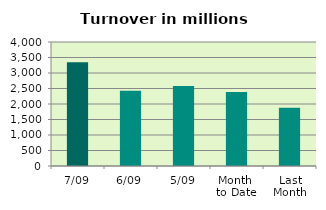
| Category | Series 0 |
|---|---|
| 7/09 | 3350.076 |
| 6/09 | 2426.512 |
| 5/09 | 2580.34 |
| Month 
to Date | 2388.369 |
| Last
Month | 1877.423 |